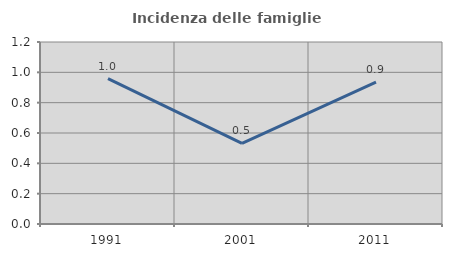
| Category | Incidenza delle famiglie numerose |
|---|---|
| 1991.0 | 0.959 |
| 2001.0 | 0.532 |
| 2011.0 | 0.936 |